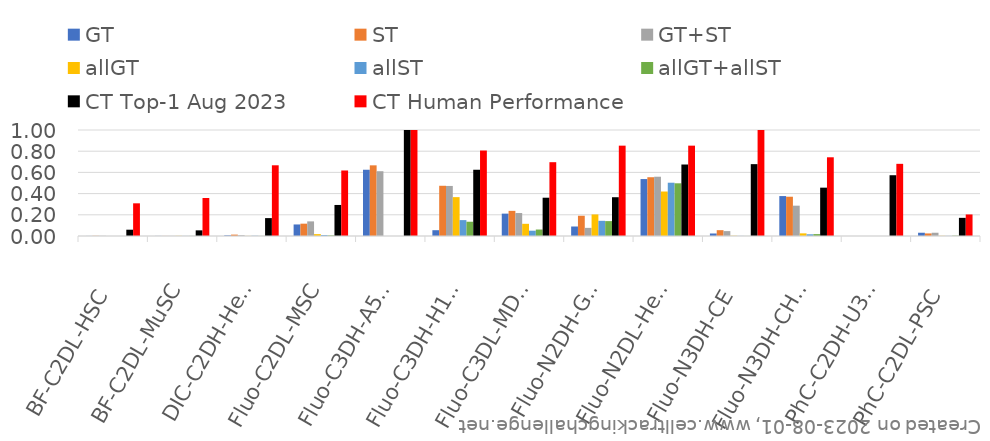
| Category | GT | ST | GT+ST | allGT | allST | allGT+allST | CT Top-1 Aug 2023 | CT Human Performance |
|---|---|---|---|---|---|---|---|---|
| BF-C2DL-HSC | 0.001 | 0.002 | 0.001 | 0 | 0 | 0 | 0.059 | 0.308 |
| BF-C2DL-MuSC | 0.001 | 0.001 | 0.001 | 0.001 | 0.001 | 0.001 | 0.053 | 0.358 |
| DIC-C2DH-HeLa | 0.006 | 0.013 | 0.007 | 0.001 | 0.002 | 0.001 | 0.169 | 0.667 |
| Fluo-C2DL-MSC | 0.109 | 0.116 | 0.138 | 0.018 | 0.009 | 0.006 | 0.293 | 0.618 |
| Fluo-C3DH-A549 | 0.625 | 0.667 | 0.611 | 0 | 0 | 0 | 1 | 1 |
| Fluo-C3DH-H157 | 0.055 | 0.474 | 0.472 | 0.367 | 0.15 | 0.135 | 0.625 | 0.806 |
| Fluo-C3DL-MDA231 | 0.211 | 0.237 | 0.217 | 0.115 | 0.05 | 0.061 | 0.361 | 0.696 |
| Fluo-N2DH-GOWT1 | 0.09 | 0.191 | 0.077 | 0.203 | 0.143 | 0.14 | 0.366 | 0.852 |
| Fluo-N2DL-HeLa | 0.537 | 0.554 | 0.559 | 0.42 | 0.503 | 0.497 | 0.674 | 0.852 |
| Fluo-N3DH-CE | 0.024 | 0.055 | 0.046 | 0.002 | 0.001 | 0 | 0.678 | 1 |
| Fluo-N3DH-CHO | 0.377 | 0.371 | 0.286 | 0.025 | 0.016 | 0.018 | 0.456 | 0.743 |
| PhC-C2DH-U373 | 0 | 0 | 0 | 0 | 0 | 0 | 0.573 | 0.681 |
| PhC-C2DL-PSC | 0.031 | 0.024 | 0.031 | 0.002 | 0.001 | 0.003 | 0.171 | 0.203 |